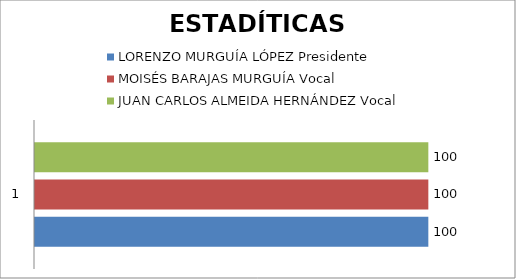
| Category | LORENZO MURGUÍA LÓPEZ Presidente | MOISÉS BARAJAS MURGUÍA Vocal | JUAN CARLOS ALMEIDA HERNÁNDEZ Vocal |
|---|---|---|---|
| 0 | 100 | 100 | 100 |